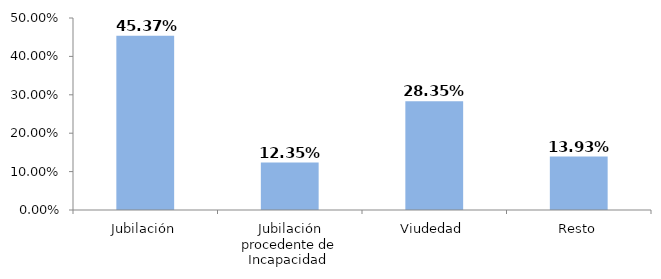
| Category | Series 0 |
|---|---|
| Jubilación | 0.454 |
| Jubilación procedente de Incapacidad  | 0.124 |
| Viudedad | 0.284 |
| Resto | 0.139 |